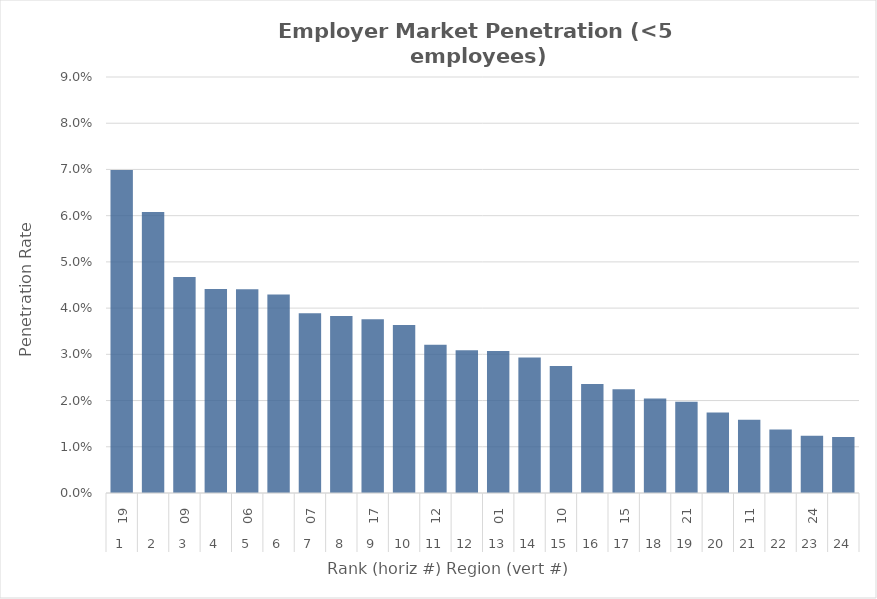
| Category | Rate |
|---|---|
| 0 | 0.07 |
| 1 | 0.061 |
| 2 | 0.047 |
| 3 | 0.044 |
| 4 | 0.044 |
| 5 | 0.043 |
| 6 | 0.039 |
| 7 | 0.038 |
| 8 | 0.038 |
| 9 | 0.036 |
| 10 | 0.032 |
| 11 | 0.031 |
| 12 | 0.031 |
| 13 | 0.029 |
| 14 | 0.027 |
| 15 | 0.024 |
| 16 | 0.022 |
| 17 | 0.02 |
| 18 | 0.02 |
| 19 | 0.017 |
| 20 | 0.016 |
| 21 | 0.014 |
| 22 | 0.012 |
| 23 | 0.012 |